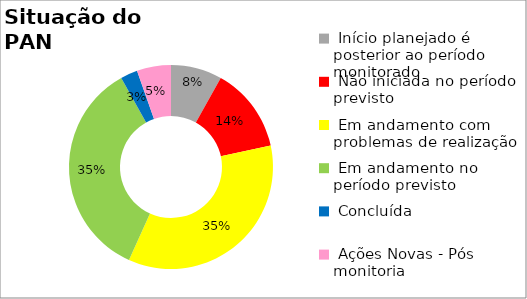
| Category | Series 0 |
|---|---|
|  Início planejado é posterior ao período monitorado | 0.081 |
|  Não iniciada no período previsto | 0.135 |
|  Em andamento com problemas de realização | 0.351 |
|  Em andamento no período previsto  | 0.351 |
|  Concluída | 0.027 |
|  Ações Novas - Pós monitoria | 0.054 |